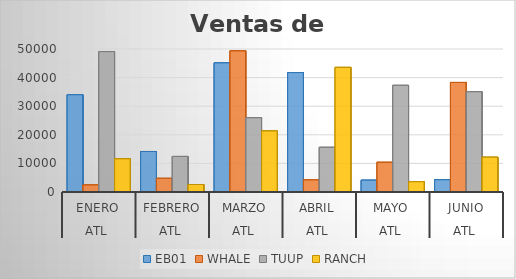
| Category | EB01 | WHALE | TUUP | RANCH |
|---|---|---|---|---|
| 0 | 34024 | 2489 | 49084 | 11614 |
| 1 | 14166 | 4787 | 12435 | 2617 |
| 2 | 45174 | 49363 | 25981 | 21358 |
| 3 | 41764 | 4258 | 15640 | 43590 |
| 4 | 4150 | 10407 | 37305 | 3602 |
| 5 | 4310 | 38304 | 35069 | 12178 |